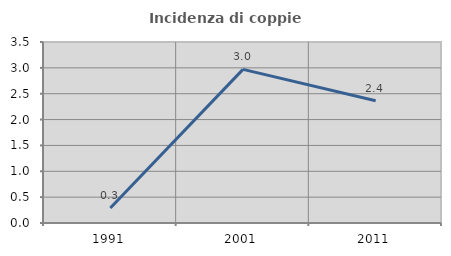
| Category | Incidenza di coppie miste |
|---|---|
| 1991.0 | 0.29 |
| 2001.0 | 2.97 |
| 2011.0 | 2.365 |